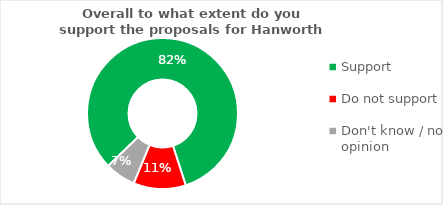
| Category | Series 0 |
|---|---|
| Support | 0.822 |
| Do not support | 0.112 |
| Don't know / no opinion | 0.065 |